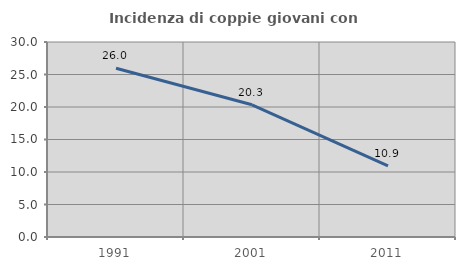
| Category | Incidenza di coppie giovani con figli |
|---|---|
| 1991.0 | 25.955 |
| 2001.0 | 20.341 |
| 2011.0 | 10.933 |